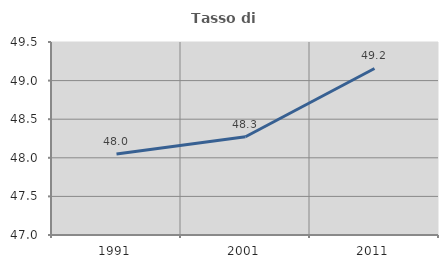
| Category | Tasso di occupazione   |
|---|---|
| 1991.0 | 48.049 |
| 2001.0 | 48.273 |
| 2011.0 | 49.157 |